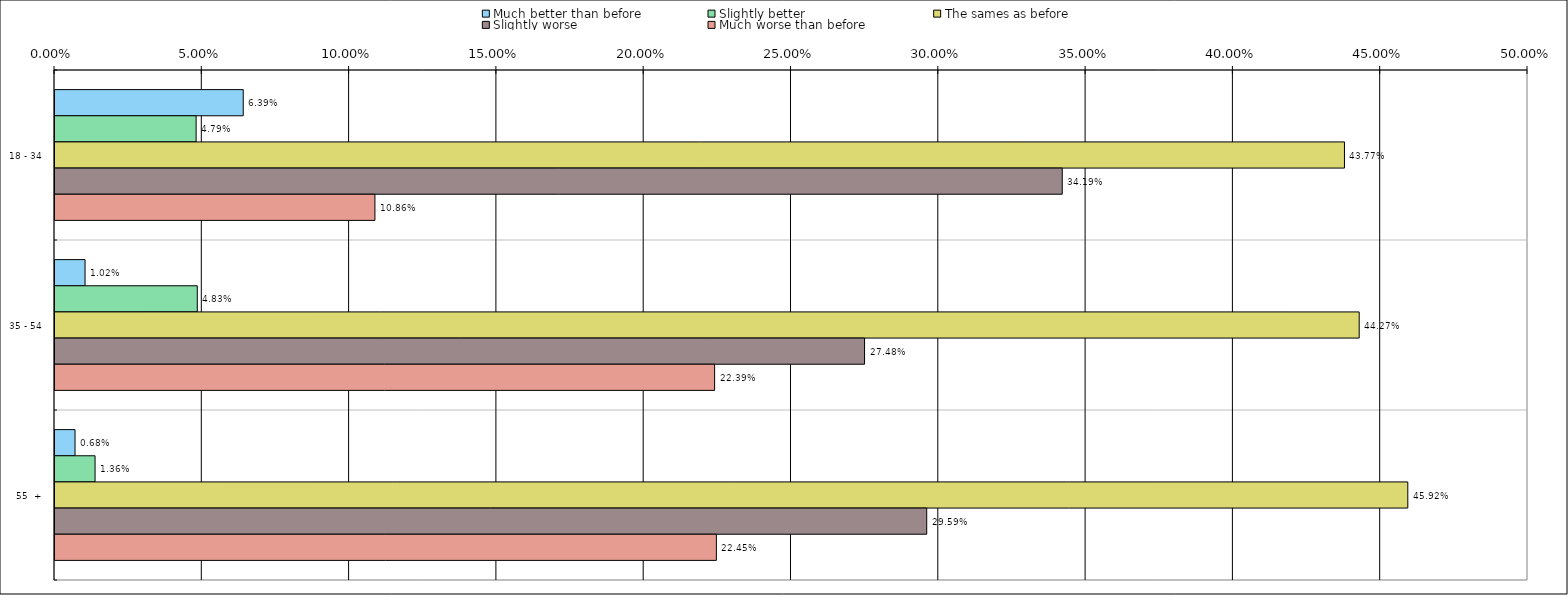
| Category | Much better than before | Slightly better | The sames as before | Slightly worse | Much worse than before |
|---|---|---|---|---|---|
| 0 | 0.064 | 0.048 | 0.438 | 0.342 | 0.109 |
| 1 | 0.01 | 0.048 | 0.443 | 0.275 | 0.224 |
| 2 | 0.007 | 0.014 | 0.459 | 0.296 | 0.224 |